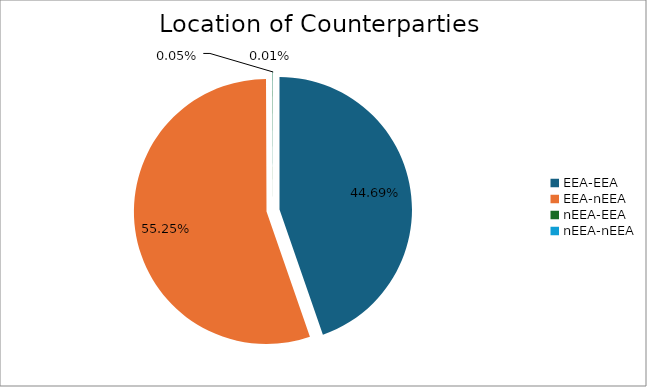
| Category | Series 0 |
|---|---|
| EEA-EEA | 6407321.923 |
| EEA-nEEA | 7922572.26 |
| nEEA-EEA | 6741.884 |
| nEEA-nEEA | 1833.397 |